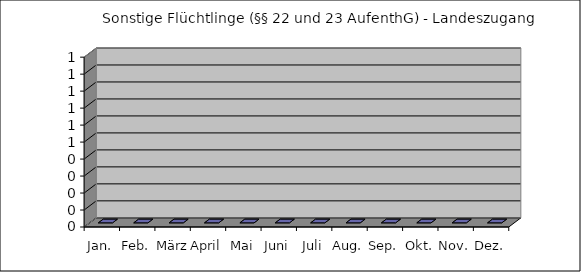
| Category | Irak-Flüchtlinge |
|---|---|
| Jan. | 0 |
| Feb. | 0 |
| März | 0 |
| April | 0 |
| Mai | 0 |
| Juni | 0 |
| Juli | 0 |
| Aug. | 0 |
| Sep. | 0 |
| Okt. | 0 |
| Nov. | 0 |
| Dez. | 0 |